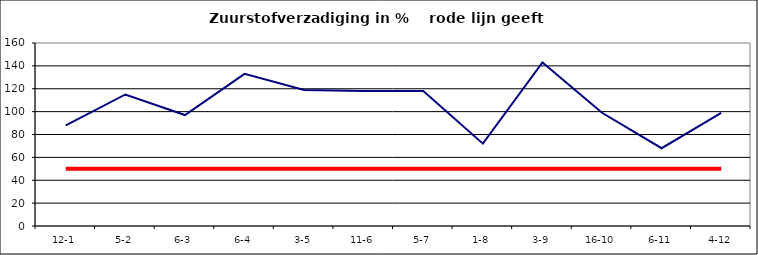
| Category | Series 0 | Series 1 |
|---|---|---|
| 12-1 | 88 | 50 |
| 5-2 | 115 | 50 |
| 6-3 | 97 | 50 |
| 6-4 | 133 | 50 |
| 3-5 | 119 | 50 |
| 11-6 | 118 | 50 |
| 5-7 | 118 | 50 |
| 1-8 | 72 | 50 |
| 3-9 | 143 | 50 |
| 16-10 | 99 | 50 |
| 6-11 | 68 | 50 |
| 4-12 | 99 | 50 |